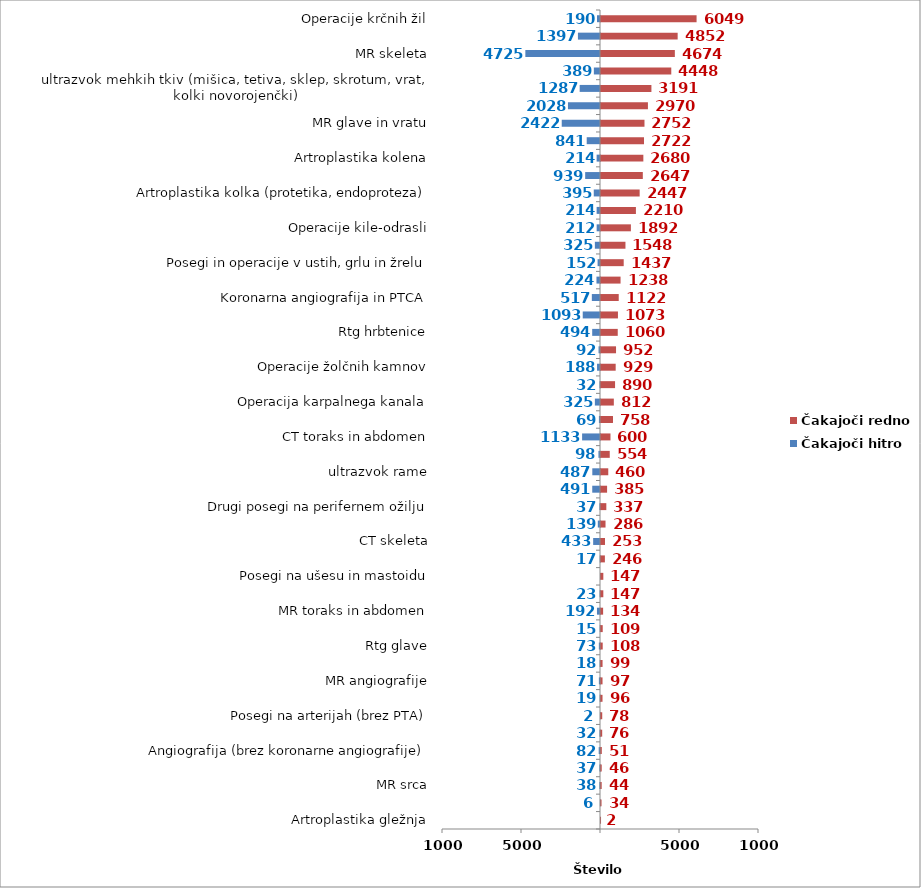
| Category | Čakajoči hitro | Čakajoči redno |
|---|---|---|
| Artroplastika gležnja | 0 | 2 |
| Operacije kile-otroci | -6 | 34 |
| MR srca | -38 | 44 |
| CT srca | -37 | 46 |
| Angiografija (brez koronarne angiografije) | -82 | 51 |
| PTA (perkutana transluminalna angioplastika) | -32 | 76 |
| Posegi na arterijah (brez PTA) | -2 | 78 |
| Rtg abdomna | -19 | 96 |
| MR angiografije | -71 | 97 |
| Rtg ledvic in sečnega mehurja | -18 | 99 |
| Rtg glave | -73 | 108 |
| Operacija ščitnice (tudi obščitnice) | -15 | 109 |
| MR toraks in abdomen | -192 | 134 |
| Operacije na odprtem srcu | -23 | 147 |
| Posegi na ušesu in mastoidu | 0 | 147 |
| Sklerozacija krčnih žil | -17 | 246 |
| CT skeleta | -433 | 253 |
| Elektroencefalografija (EEG) | -139 | 286 |
| Drugi posegi na perifernem ožilju | -37 | 337 |
| CT angiografije | -491 | 385 |
| ultrazvok rame | -487 | 460 |
| Ortopedska operacija rame (samo terapevstki posegi na rami) | -98 | 554 |
| CT toraks in abdomen | -1133 | 600 |
| Rtg PC | -69 | 758 |
| Operacija karpalnega kanala | -325 | 812 |
| Posegi in operacije nosu in obnosnih votlin | -32 | 890 |
| Operacije žolčnih kamnov | -188 | 929 |
| Rtg mamografija | -92 | 952 |
| Rtg hrbtenice | -494 | 1060 |
| CT glave in vratu | -1093 | 1073 |
| Koronarna angiografija in PTCA | -517 | 1122 |
| Posegi in operacije hrbtenice | -224 | 1238 |
| Posegi in operacije v ustih, grlu in žrelu | -152 | 1437 |
| Terapevtske artroskopije (kolenske križne vezi, kolena) | -325 | 1548 |
| Operacije kile-odrasli | -212 | 1892 |
| ultrazvok dojke | -214 | 2210 |
| Artroplastika kolka (protetika, endoproteza) | -395 | 2447 |
| Rtg skletela | -939 | 2647 |
| Artroplastika kolena | -214 | 2680 |
| ultrazvok vratnih žil | -841 | 2722 |
| MR glave in vratu | -2422 | 2752 |
| Elektromiografija (EMG) | -2028 | 2970 |
| ultrazvok mehkih tkiv (mišica, tetiva, sklep, skrotum, vrat, kolki novorojenčki) | -1287 | 3191 |
| Operacija sive mrene (katarakta) | -389 | 4448 |
| MR skeleta | -4725 | 4674 |
| ultrazvok srca | -1397 | 4852 |
| Operacije krčnih žil | -190 | 6049 |